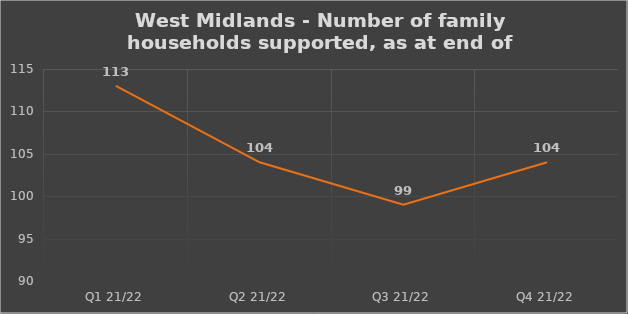
| Category | Number of financially supported households at end of quarter |
|---|---|
| Q1 21/22 | 113 |
| Q2 21/22 | 104 |
| Q3 21/22 | 99 |
| Q4 21/22 | 104 |